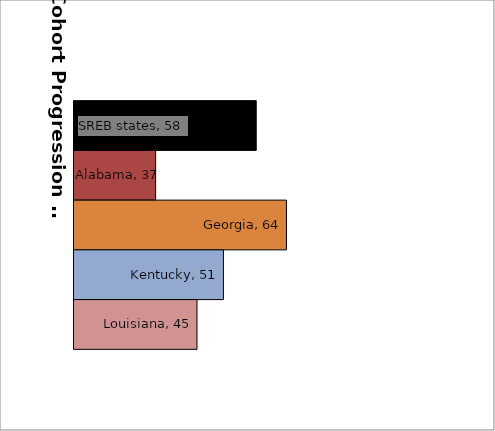
| Category | SREB states | Alabama | Georgia | Kentucky | Louisiana |
|---|---|---|---|---|---|
| 0 | 57.669 | 36.874 | 63.918 | 50.888 | 45.424 |